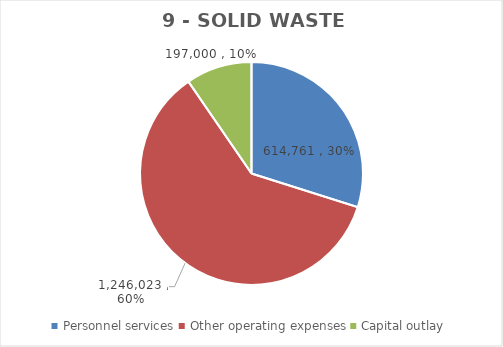
| Category | Series 0 | Series 1 | Series 2 | Series 3 | Series 4 | Series 5 | Series 6 |
|---|---|---|---|---|---|---|---|
| Personnel services | 614761 |  |  | 608399 | 600622 | 614761 | 614761 |
| Other operating expenses | 1246023 |  |  | 1079913 | 1147039 | 1246023 | 1246023 |
| Capital outlay | 197000 |  |  | 126781 | 102000 | 217000 | 197000 |